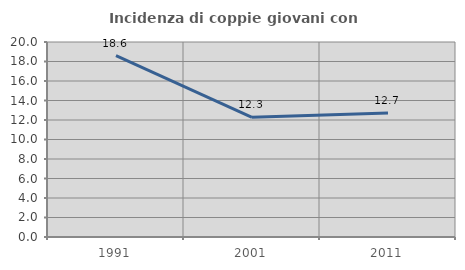
| Category | Incidenza di coppie giovani con figli |
|---|---|
| 1991.0 | 18.605 |
| 2001.0 | 12.281 |
| 2011.0 | 12.717 |